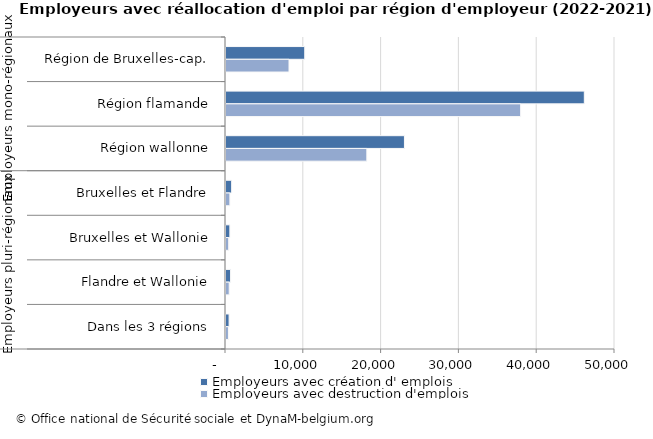
| Category | Employeurs avec création d' emplois | Employeurs avec destruction d'emplois |
|---|---|---|
| 0 | 10122 | 8098 |
| 1 | 46056 | 37873 |
| 2 | 22937 | 18102 |
| 3 | 727 | 499 |
| 4 | 497 | 346 |
| 5 | 589 | 413 |
| 6 | 396 | 315 |